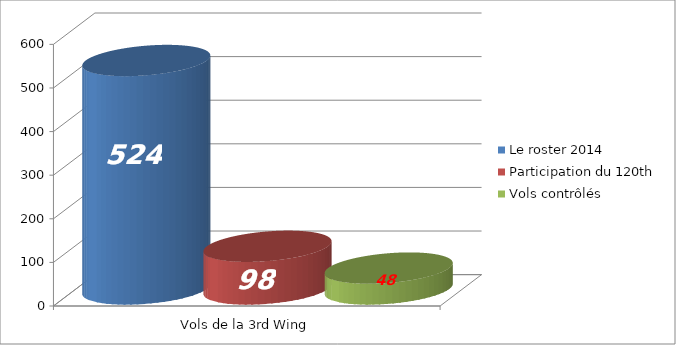
| Category | Le roster 2014 | Participation du 120th | Vols contrôlés |
|---|---|---|---|
| 0 | 524 | 98 | 48 |